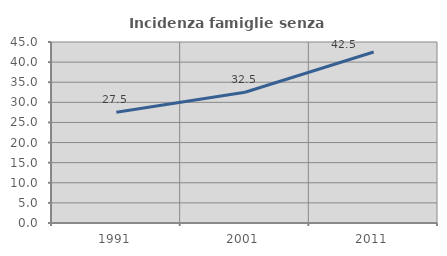
| Category | Incidenza famiglie senza nuclei |
|---|---|
| 1991.0 | 27.549 |
| 2001.0 | 32.514 |
| 2011.0 | 42.515 |